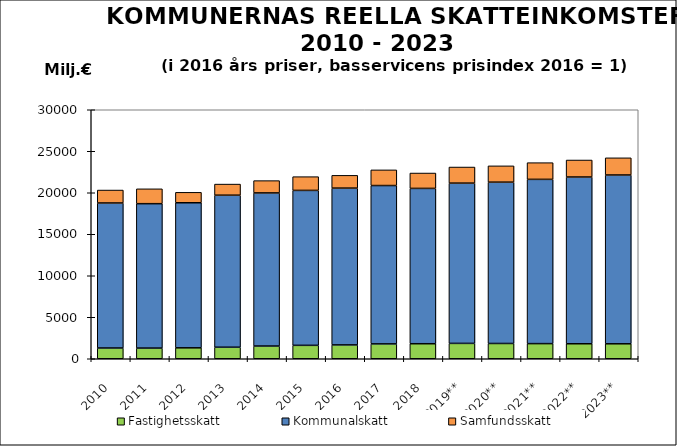
| Category | Fastighetsskatt | Kommunalskatt | Samfundsskatt |
|---|---|---|---|
| 2010 | 1296.352 | 17470.608 | 1559.108 |
| 2011 | 1285.841 | 17398.198 | 1789.548 |
| 2012 | 1317.524 | 17476.044 | 1257.689 |
| 2013 | 1389.588 | 18317.532 | 1337.058 |
| 2014 | 1532.817 | 18447.864 | 1481.581 |
| 2015 | 1616.418 | 18667.185 | 1654.236 |
| 2016 | 1669.703 | 18890.563 | 1537.872 |
| 2017 | 1790.628 | 19079.061 | 1886.129 |
| 2018 | 1809.209 | 18714.38 | 1852.755 |
| 2019** | 1851.566 | 19309.189 | 1939.736 |
| 2020** | 1839.395 | 19438.191 | 1963.937 |
| 2021** | 1822.317 | 19791.863 | 2010.184 |
| 2022** | 1807.172 | 20090.955 | 2046.899 |
| 2023** | 1802.883 | 20339.059 | 2065.615 |